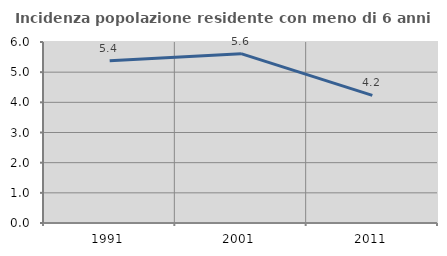
| Category | Incidenza popolazione residente con meno di 6 anni |
|---|---|
| 1991.0 | 5.378 |
| 2001.0 | 5.614 |
| 2011.0 | 4.232 |